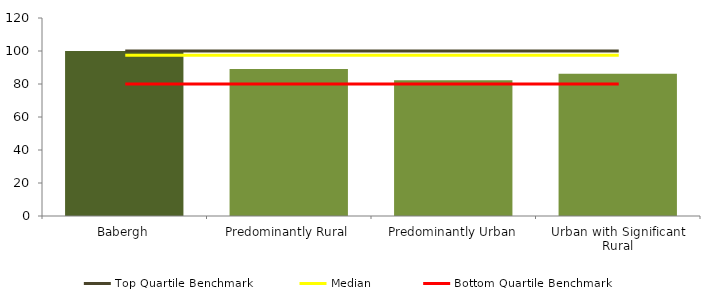
| Category | Series 0 |
|---|---|
| Babergh | 100 |
| Predominantly Rural | 89.075 |
| Predominantly Urban | 82.332 |
| Urban with Significant Rural | 86.277 |